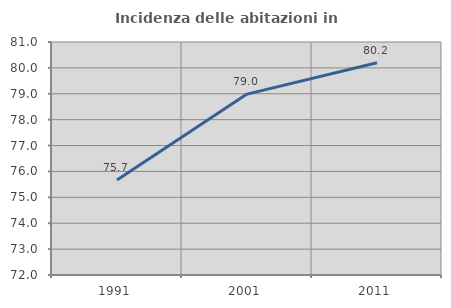
| Category | Incidenza delle abitazioni in proprietà  |
|---|---|
| 1991.0 | 75.668 |
| 2001.0 | 78.987 |
| 2011.0 | 80.197 |